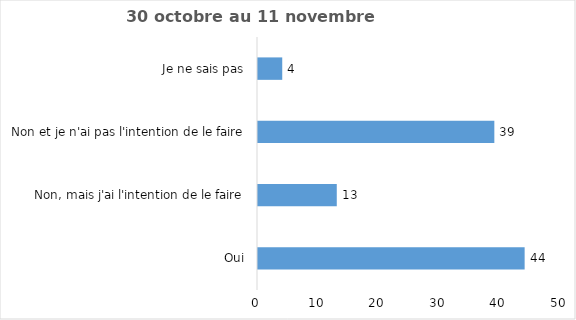
| Category | Series 0 |
|---|---|
| Oui | 44 |
| Non, mais j'ai l'intention de le faire | 13 |
| Non et je n'ai pas l'intention de le faire | 39 |
| Je ne sais pas | 4 |